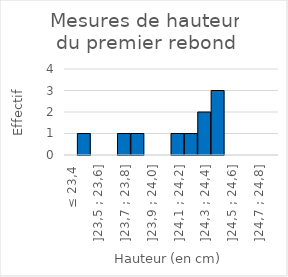
| Category | ≤ 23,4 |
|---|---|
| ≤ 23,4 | 0 |
| ]23,4 ; 23,5] | 1 |
| ]23,5 ; 23,6] | 0 |
| ]23,6 ; 23,7] | 0 |
| ]23,7 ; 23,8] | 1 |
| ]23,8 ; 23,9] | 1 |
| ]23,9 ; 24,0] | 0 |
| ]24,0 ; 24,1] | 0 |
| ]24,1 ; 24,2] | 1 |
| ]24,2 ; 24,3] | 1 |
| ]24,3 ; 24,4] | 2 |
| ]24,4 ; 24,5] | 3 |
| ]24,5 ; 24,6] | 0 |
| ]24,6 ; 24,7] | 0 |
| ]24,7 ; 24,8] | 0 |
| > 24,8 | 0 |